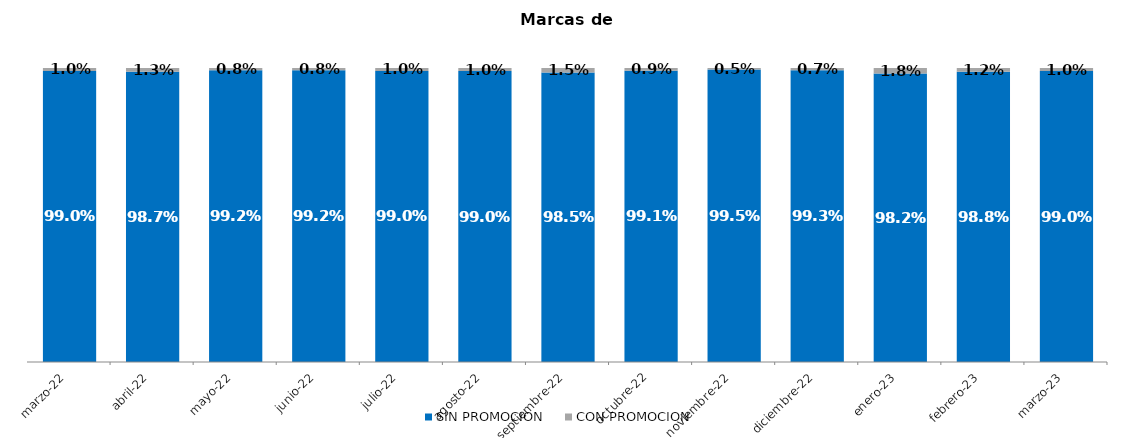
| Category | SIN PROMOCION   | CON PROMOCION   |
|---|---|---|
| 2022-03-01 | 0.99 | 0.01 |
| 2022-04-01 | 0.987 | 0.013 |
| 2022-05-01 | 0.992 | 0.008 |
| 2022-06-01 | 0.992 | 0.008 |
| 2022-07-01 | 0.99 | 0.01 |
| 2022-08-01 | 0.99 | 0.01 |
| 2022-09-01 | 0.985 | 0.015 |
| 2022-10-01 | 0.991 | 0.009 |
| 2022-11-01 | 0.995 | 0.005 |
| 2022-12-01 | 0.993 | 0.007 |
| 2023-01-01 | 0.982 | 0.018 |
| 2023-02-01 | 0.988 | 0.012 |
| 2023-03-01 | 0.99 | 0.01 |